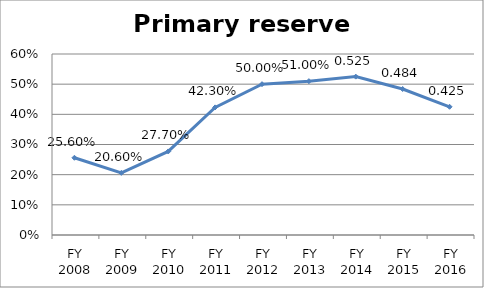
| Category | Primary reserve ratio |
|---|---|
| FY 2016 | 0.425 |
| FY 2015 | 0.484 |
| FY 2014 | 0.525 |
| FY 2013 | 0.51 |
| FY 2012 | 0.5 |
| FY 2011 | 0.423 |
| FY 2010 | 0.277 |
| FY 2009 | 0.206 |
| FY 2008 | 0.256 |